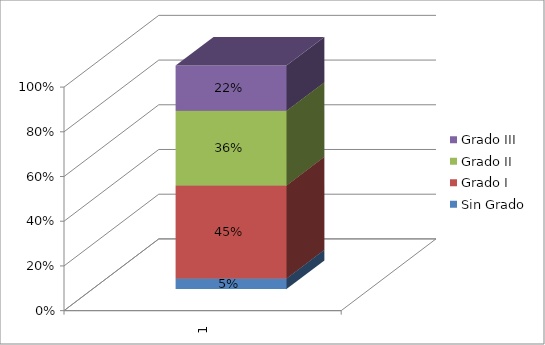
| Category | Sin Grado | Grado I | Grado II | Grado III |
|---|---|---|---|---|
| 0 | 0.051 | 0.447 | 0.358 | 0.217 |